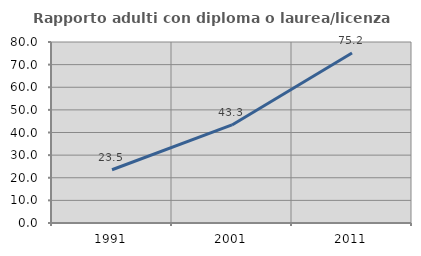
| Category | Rapporto adulti con diploma o laurea/licenza media  |
|---|---|
| 1991.0 | 23.529 |
| 2001.0 | 43.333 |
| 2011.0 | 75.159 |